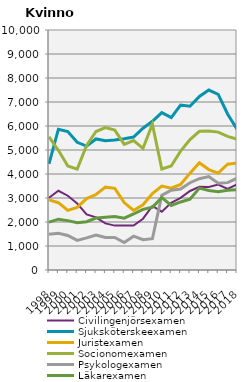
| Category | Civilingenjörsexamen | Sjuksköterskeexamen | Juristexamen | Socionomexamen | Psykologexamen | Läkarexamen |
|---|---|---|---|---|---|---|
| 1998.0 | 3011 | 4426 | 2923 | 5547 | 1492 | 1997 |
| 1999.0 | 3301 | 5866 | 2804 | 4989 | 1533 | 2118 |
| 2000.0 | 3095 | 5768 | 2485 | 4333 | 1438 | 2057 |
| 2001.0 | 2768 | 5319 | 2606 | 4204 | 1233 | 1967 |
| 2002.0 | 2318 | 5163 | 2974 | 5188 | 1337 | 2011 |
| 2003.0 | 2193 | 5460 | 3145 | 5770 | 1458 | 2165 |
| 2004.0 | 1943 | 5389 | 3452 | 5932 | 1353 | 2200 |
| 2005.0 | 1850 | 5421 | 3401 | 5830 | 1355 | 2227 |
| 2006.0 | 1854 | 5472 | 2808 | 5237 | 1145 | 2158 |
| 2007.0 | 1855 | 5538 | 2479 | 5394 | 1411 | 2334 |
| 2008.0 | 2138 | 5907 | 2718 | 5070 | 1264 | 2526 |
| 2009.0 | 2666 | 6195 | 3188 | 6074 | 1303 | 2612 |
| 2010.0 | 2431 | 6556 | 3494 | 4210 | 3110 | 3023 |
| 2011.0 | 2797 | 6351 | 3407 | 4335 | 3325 | 2688 |
| 2012.0 | 3006 | 6873 | 3564 | 4953 | 3374 | 2836 |
| 2013.0 | 3292 | 6826 | 4036 | 5436 | 3636 | 2951 |
| 2014.0 | 3468 | 7229 | 4468 | 5780 | 3805 | 3411 |
| 2015.0 | 3461 | 7497 | 4184 | 5787 | 3896 | 3311 |
| 2016.0 | 3562 | 7321 | 4036 | 5745 | 3618 | 3263 |
| 2017.0 | 3378 | 6502 | 4410 | 5564 | 3640 | 3323 |
| 2018.0 | 3563 | 5866 | 4448 | 5451 | 3821 | 3343 |